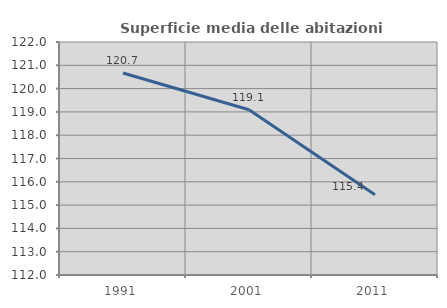
| Category | Superficie media delle abitazioni occupate |
|---|---|
| 1991.0 | 120.669 |
| 2001.0 | 119.094 |
| 2011.0 | 115.439 |